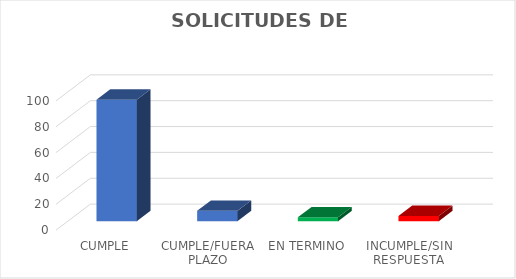
| Category | Series 0 |
|---|---|
| CUMPLE | 94 |
| CUMPLE/FUERA PLAZO | 8 |
| EN TERMINO | 3 |
| INCUMPLE/SIN RESPUESTA | 4 |